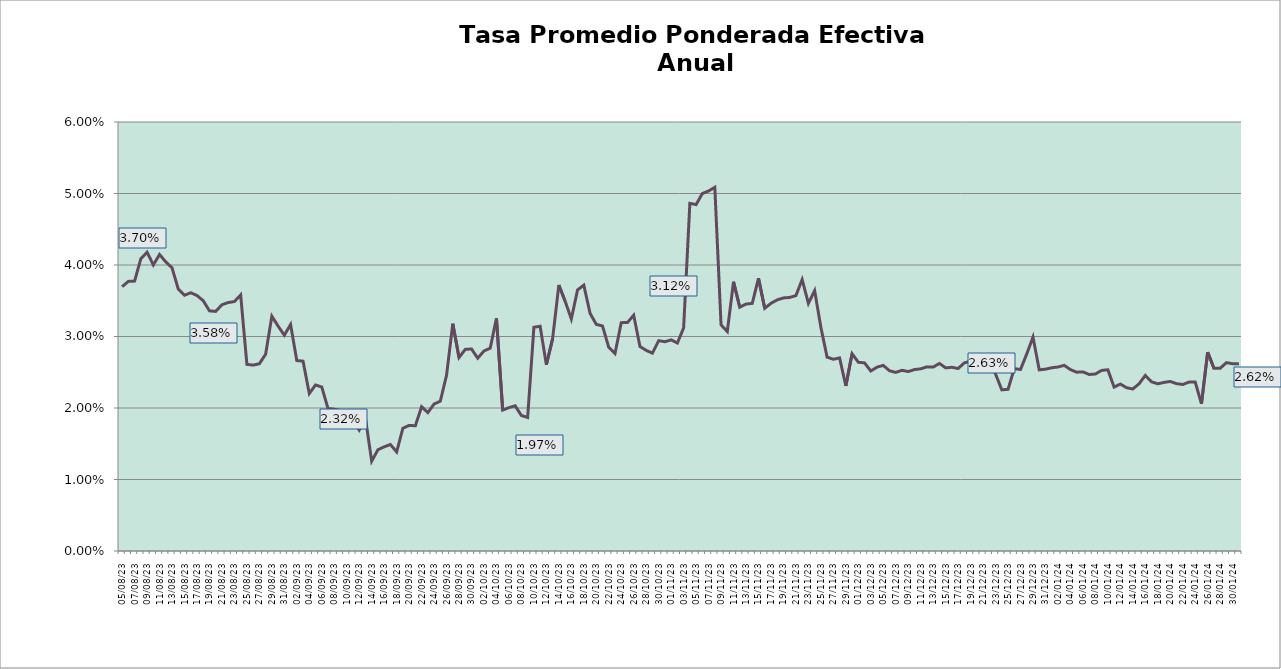
| Category | TEA |
|---|---|
| 2023-08-05 | 0.037 |
| 2023-08-06 | 0.038 |
| 2023-08-07 | 0.038 |
| 2023-08-08 | 0.041 |
| 2023-08-09 | 0.042 |
| 2023-08-10 | 0.04 |
| 2023-08-11 | 0.041 |
| 2023-08-12 | 0.04 |
| 2023-08-13 | 0.04 |
| 2023-08-14 | 0.037 |
| 2023-08-15 | 0.036 |
| 2023-08-16 | 0.036 |
| 2023-08-17 | 0.036 |
| 2023-08-18 | 0.035 |
| 2023-08-19 | 0.034 |
| 2023-08-20 | 0.034 |
| 2023-08-21 | 0.034 |
| 2023-08-22 | 0.035 |
| 2023-08-23 | 0.035 |
| 2023-08-24 | 0.036 |
| 2023-08-25 | 0.026 |
| 2023-08-26 | 0.026 |
| 2023-08-27 | 0.026 |
| 2023-08-28 | 0.028 |
| 2023-08-29 | 0.033 |
| 2023-08-30 | 0.031 |
| 2023-08-31 | 0.03 |
| 2023-09-01 | 0.032 |
| 2023-09-02 | 0.027 |
| 2023-09-03 | 0.027 |
| 2023-09-04 | 0.022 |
| 2023-09-05 | 0.023 |
| 2023-09-06 | 0.023 |
| 2023-09-07 | 0.02 |
| 2023-09-08 | 0.02 |
| 2023-09-09 | 0.02 |
| 2023-09-10 | 0.018 |
| 2023-09-11 | 0.018 |
| 2023-09-12 | 0.017 |
| 2023-09-13 | 0.019 |
| 2023-09-14 | 0.013 |
| 2023-09-15 | 0.014 |
| 2023-09-16 | 0.015 |
| 2023-09-17 | 0.015 |
| 2023-09-18 | 0.014 |
| 2023-09-19 | 0.017 |
| 2023-09-20 | 0.018 |
| 2023-09-21 | 0.018 |
| 2023-09-22 | 0.02 |
| 2023-09-23 | 0.019 |
| 2023-09-24 | 0.021 |
| 2023-09-25 | 0.021 |
| 2023-09-26 | 0.025 |
| 2023-09-27 | 0.032 |
| 2023-09-28 | 0.027 |
| 2023-09-29 | 0.028 |
| 2023-09-30 | 0.028 |
| 2023-10-01 | 0.027 |
| 2023-10-02 | 0.028 |
| 2023-10-03 | 0.028 |
| 2023-10-04 | 0.033 |
| 2023-10-05 | 0.02 |
| 2023-10-06 | 0.02 |
| 2023-10-07 | 0.02 |
| 2023-10-08 | 0.019 |
| 2023-10-09 | 0.019 |
| 2023-10-10 | 0.031 |
| 2023-10-11 | 0.031 |
| 2023-10-12 | 0.026 |
| 2023-10-13 | 0.03 |
| 2023-10-14 | 0.037 |
| 2023-10-15 | 0.035 |
| 2023-10-16 | 0.032 |
| 2023-10-17 | 0.037 |
| 2023-10-18 | 0.037 |
| 2023-10-19 | 0.033 |
| 2023-10-20 | 0.032 |
| 2023-10-21 | 0.031 |
| 2023-10-22 | 0.028 |
| 2023-10-23 | 0.028 |
| 2023-10-24 | 0.032 |
| 2023-10-25 | 0.032 |
| 2023-10-26 | 0.033 |
| 2023-10-27 | 0.029 |
| 2023-10-28 | 0.028 |
| 2023-10-29 | 0.028 |
| 2023-10-30 | 0.029 |
| 2023-10-31 | 0.029 |
| 2023-11-01 | 0.03 |
| 2023-11-02 | 0.029 |
| 2023-11-03 | 0.031 |
| 2023-11-04 | 0.049 |
| 2023-11-05 | 0.048 |
| 2023-11-06 | 0.05 |
| 2023-11-07 | 0.05 |
| 2023-11-08 | 0.051 |
| 2023-11-09 | 0.032 |
| 2023-11-10 | 0.031 |
| 2023-11-11 | 0.038 |
| 2023-11-12 | 0.034 |
| 2023-11-13 | 0.035 |
| 2023-11-14 | 0.035 |
| 2023-11-15 | 0.038 |
| 2023-11-16 | 0.034 |
| 2023-11-17 | 0.035 |
| 2023-11-18 | 0.035 |
| 2023-11-19 | 0.035 |
| 2023-11-20 | 0.035 |
| 2023-11-21 | 0.036 |
| 2023-11-22 | 0.038 |
| 2023-11-23 | 0.035 |
| 2023-11-24 | 0.036 |
| 2023-11-25 | 0.031 |
| 2023-11-26 | 0.027 |
| 2023-11-27 | 0.027 |
| 2023-11-28 | 0.027 |
| 2023-11-29 | 0.023 |
| 2023-11-30 | 0.028 |
| 2023-12-01 | 0.026 |
| 2023-12-02 | 0.026 |
| 2023-12-03 | 0.025 |
| 2023-12-04 | 0.026 |
| 2023-12-05 | 0.026 |
| 2023-12-06 | 0.025 |
| 2023-12-07 | 0.025 |
| 2023-12-08 | 0.025 |
| 2023-12-09 | 0.025 |
| 2023-12-10 | 0.025 |
| 2023-12-11 | 0.025 |
| 2023-12-12 | 0.026 |
| 2023-12-13 | 0.026 |
| 2023-12-14 | 0.026 |
| 2023-12-15 | 0.026 |
| 2023-12-16 | 0.026 |
| 2023-12-17 | 0.026 |
| 2023-12-18 | 0.026 |
| 2023-12-19 | 0.027 |
| 2023-12-20 | 0.027 |
| 2023-12-21 | 0.026 |
| 2023-12-22 | 0.026 |
| 2023-12-23 | 0.025 |
| 2023-12-24 | 0.023 |
| 2023-12-25 | 0.023 |
| 2023-12-26 | 0.026 |
| 2023-12-27 | 0.025 |
| 2023-12-28 | 0.028 |
| 2023-12-29 | 0.03 |
| 2023-12-30 | 0.025 |
| 2023-12-31 | 0.025 |
| 2024-01-01 | 0.026 |
| 2024-01-02 | 0.026 |
| 2024-01-03 | 0.026 |
| 2024-01-04 | 0.025 |
| 2024-01-05 | 0.025 |
| 2024-01-06 | 0.025 |
| 2024-01-07 | 0.025 |
| 2024-01-08 | 0.025 |
| 2024-01-09 | 0.025 |
| 2024-01-10 | 0.025 |
| 2024-01-11 | 0.023 |
| 2024-01-12 | 0.023 |
| 2024-01-13 | 0.023 |
| 2024-01-14 | 0.023 |
| 2024-01-15 | 0.023 |
| 2024-01-16 | 0.025 |
| 2024-01-17 | 0.024 |
| 2024-01-18 | 0.023 |
| 2024-01-19 | 0.024 |
| 2024-01-20 | 0.024 |
| 2024-01-21 | 0.023 |
| 2024-01-22 | 0.023 |
| 2024-01-23 | 0.024 |
| 2024-01-24 | 0.024 |
| 2024-01-25 | 0.021 |
| 2024-01-26 | 0.028 |
| 2024-01-27 | 0.026 |
| 2024-01-28 | 0.026 |
| 2024-01-29 | 0.026 |
| 2024-01-30 | 0.026 |
| 2024-01-31 | 0.026 |